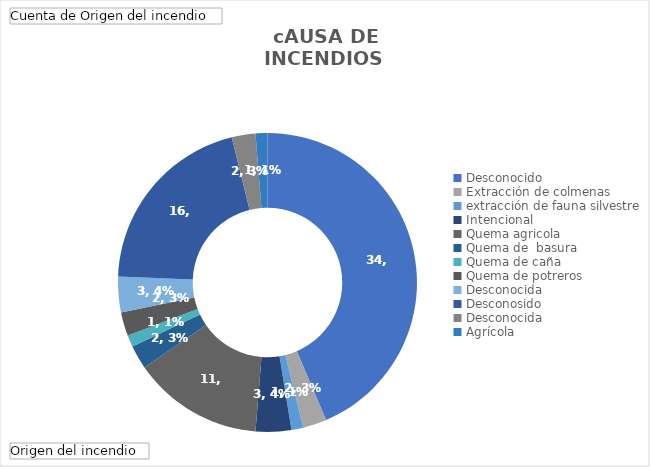
| Category | Total |
|---|---|
| Desconocido | 34 |
| Extracción de colmenas  | 2 |
| extracción de fauna silvestre | 1 |
| Intencional | 3 |
| Quema agricola | 11 |
| Quema de  basura  | 2 |
| Quema de caña  | 1 |
| Quema de potreros  | 2 |
| Desconocida | 3 |
| Desconosido | 16 |
| Desconocida  | 2 |
| Agrícola, aparentemente intencional | 1 |